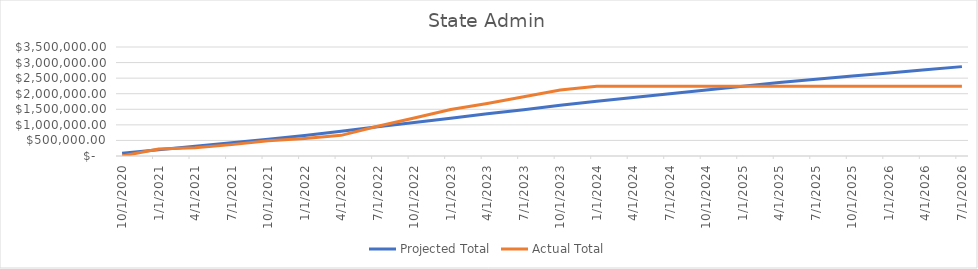
| Category | Projected Total | Actual Total |
|---|---|---|
| 10/1/20 | 91226.159 | 0 |
| 1/1/21 | 203034.929 | 222997.59 |
| 4/1/21 | 314843.698 | 264447.59 |
| 7/1/21 | 426652.467 | 365076.59 |
| 10/1/21 | 538461.237 | 489436.59 |
| 1/1/22 | 658046.506 | 564600.59 |
| 4/1/22 | 797118.545 | 663454.59 |
| 7/1/22 | 936190.583 | 956505.59 |
| 10/1/22 | 1075262.622 | 1222115.59 |
| 1/1/23 | 1214334.661 | 1494745.06 |
| 4/1/23 | 1353406.699 | 1687445.06 |
| 7/1/23 | 1485559.738 | 1902071.68 |
| 10/1/23 | 1627671.11 | 2117249.27 |
| 1/1/24 | 1754413.8 | 2238061.77 |
| 4/1/24 | 1881156.491 | 2238061.77 |
| 7/1/24 | 2001827.752 | 2238061.77 |
| 10/1/24 | 2122499.014 | 2238061.77 |
| 1/1/25 | 2243170.276 | 2238061.77 |
| 4/1/25 | 2363841.538 | 2238061.77 |
| 7/1/25 | 2465026.03 | 2238061.77 |
| 10/1/25 | 2566210.523 | 2238061.77 |
| 1/1/26 | 2667395.015 | 2238061.77 |
| 4/1/26 | 2768579.508 | 2238061.77 |
| 7/1/26 | 2869764 | 2238061.77 |